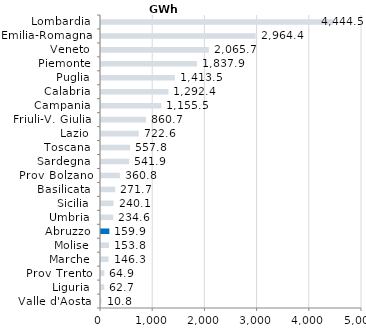
| Category | Series 0 |
|---|---|
| Valle d'Aosta | 10.8 |
| Liguria | 62.7 |
| Prov Trento | 64.9 |
| Marche | 146.3 |
| Molise | 153.8 |
| Abruzzo | 159.9 |
| Umbria | 234.6 |
| Sicilia | 240.1 |
| Basilicata | 271.7 |
| Prov Bolzano | 360.8 |
| Sardegna | 541.9 |
| Toscana | 557.8 |
| Lazio | 722.6 |
| Friuli-V. Giulia | 860.7 |
| Campania | 1155.5 |
| Calabria | 1292.4 |
| Puglia | 1413.5 |
| Piemonte | 1837.9 |
| Veneto | 2065.7 |
| Emilia-Romagna | 2964.4 |
| Lombardia | 4444.5 |